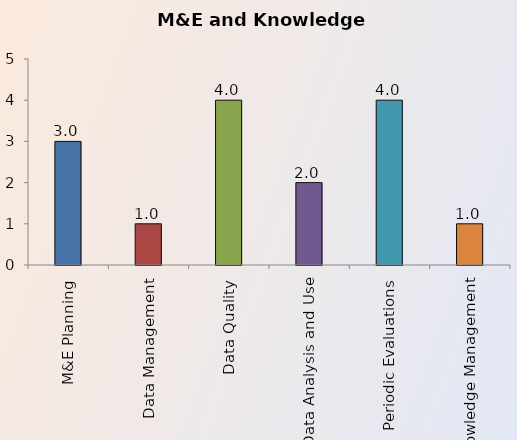
| Category | Series 0 |
|---|---|
| M&E Planning | 3 |
| Data Management | 1 |
| Data Quality | 4 |
| Data Analysis and Use | 2 |
| Periodic Evaluations | 4 |
| Knowledge Management | 1 |